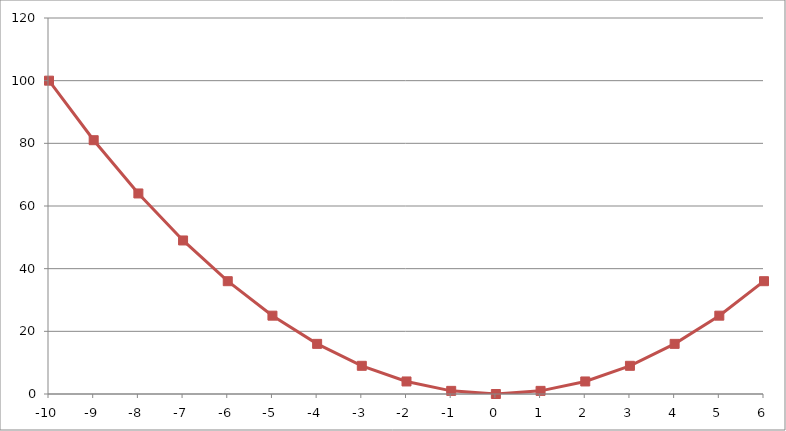
| Category | Series 1 |
|---|---|
| -10.0 | 100 |
| -9.0 | 81 |
| -8.0 | 64 |
| -7.0 | 49 |
| -6.0 | 36 |
| -5.0 | 25 |
| -4.0 | 16 |
| -3.0 | 9 |
| -2.0 | 4 |
| -1.0 | 1 |
| 0.0 | 0 |
| 1.0 | 1 |
| 2.0 | 4 |
| 3.0 | 9 |
| 4.0 | 16 |
| 5.0 | 25 |
| 6.0 | 36 |